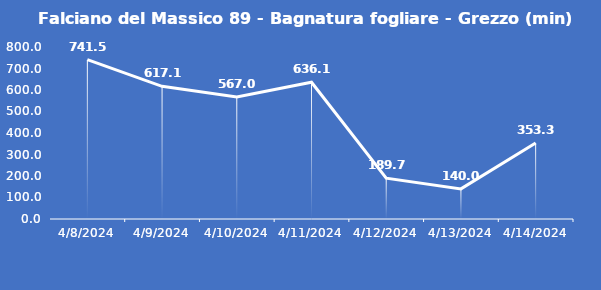
| Category | Falciano del Massico 89 - Bagnatura fogliare - Grezzo (min) |
|---|---|
| 4/8/24 | 741.5 |
| 4/9/24 | 617.1 |
| 4/10/24 | 567 |
| 4/11/24 | 636.1 |
| 4/12/24 | 189.7 |
| 4/13/24 | 140 |
| 4/14/24 | 353.3 |